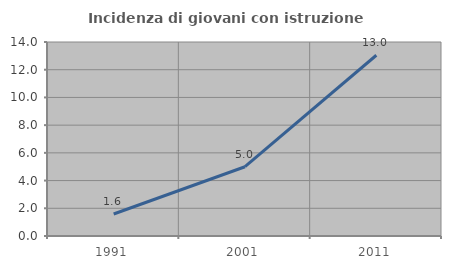
| Category | Incidenza di giovani con istruzione universitaria |
|---|---|
| 1991.0 | 1.587 |
| 2001.0 | 5 |
| 2011.0 | 13.043 |